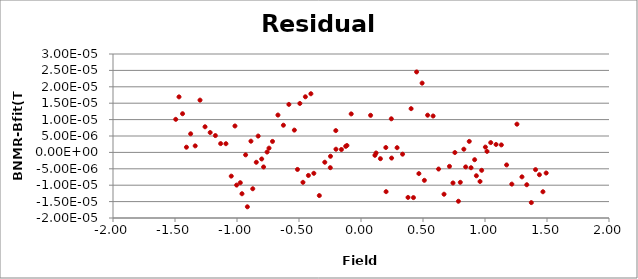
| Category | Residuals |
|---|---|
| -1.493853 | 0 |
| -1.467665 | 0 |
| -1.439102 | 0 |
| -1.407825 | 0 |
| -1.373763 | 0 |
| -1.337067 | 0 |
| -1.298194 | 0 |
| -1.257764 | 0 |
| -1.216331 | 0 |
| -1.174302 | 0 |
| -1.131878 | 0 |
| -1.089163 | 0 |
| -1.046244 | 0 |
| -1.016494 | 0 |
| -1.00312 | 0 |
| -0.973285 | 0 |
| -0.959849 | 0 |
| -0.930504 | 0 |
| -0.916453 | 0 |
| -0.887545 | 0 |
| -0.872938 | 0 |
| -0.844341 | 0 |
| -0.829322 | 0 |
| -0.800962 | 0 |
| -0.785564 | 0 |
| -0.757406 | 0 |
| -0.741699 | 0 |
| -0.713667 | 0 |
| -0.669795 | 0 |
| -0.625763 | 0 |
| -0.581633 | 0 |
| -0.537397 | 0 |
| -0.512236 | 0 |
| -0.493048 | 0 |
| -0.468013 | 0 |
| -0.448638 | 0 |
| -0.424257 | 0 |
| -0.404122 | 0 |
| -0.380341 | 0 |
| -0.336242 | 0 |
| -0.291976 | 0 |
| -0.247577 | 0 |
| -0.246051 | 0 |
| -0.203065 | 0 |
| -0.201798 | 0 |
| -0.157751 | 0 |
| -0.123159 | 0 |
| -0.113477 | 0 |
| -0.078927 | 0 |
| 0.077462 | 0 |
| 0.112332 | 0 |
| 0.121486 | 0 |
| 0.156453 | 0 |
| 0.200346 | 0 |
| 0.202286 | 0 |
| 0.244558 | 0 |
| 0.24672 | 0 |
| 0.291029 | 0 |
| 0.335205 | 0 |
| 0.379221 | 0 |
| 0.403996 | 0 |
| 0.42307 | 0 |
| 0.448503 | 0 |
| 0.466799 | 0 |
| 0.492904 | 0 |
| 0.511068 | 0 |
| 0.537243 | 0 |
| 0.581467 | 0 |
| 0.625588 | 0 |
| 0.669613 | 0 |
| 0.713479 | 0 |
| 0.741756 | 0 |
| 0.757214 | 0 |
| 0.785615 | 0 |
| 0.800768 | 0 |
| 0.829365 | 0 |
| 0.844149 | 0 |
| 0.872973 | 0 |
| 0.88736 | 0 |
| 0.916478 | 0 |
| 0.930331 | 0 |
| 0.959864 | 0 |
| 0.973131 | 0 |
| 1.003122 | 0 |
| 1.016356 | 0 |
| 1.046233 | 0 |
| 1.089139 | 0 |
| 1.131839 | 0 |
| 1.174245 | 0 |
| 1.216251 | 0 |
| 1.257656 | 0 |
| 1.298049 | 0 |
| 1.336875 | 0 |
| 1.373518 | 0 |
| 1.40752 | 0 |
| 1.438728 | 0 |
| 1.467216 | 0 |
| 1.493393 | 0 |